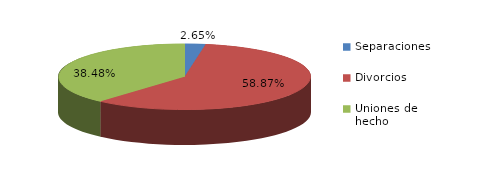
| Category | Series 0 |
|---|---|
| Separaciones | 315 |
| Divorcios | 6988 |
| Uniones de hecho | 4568 |